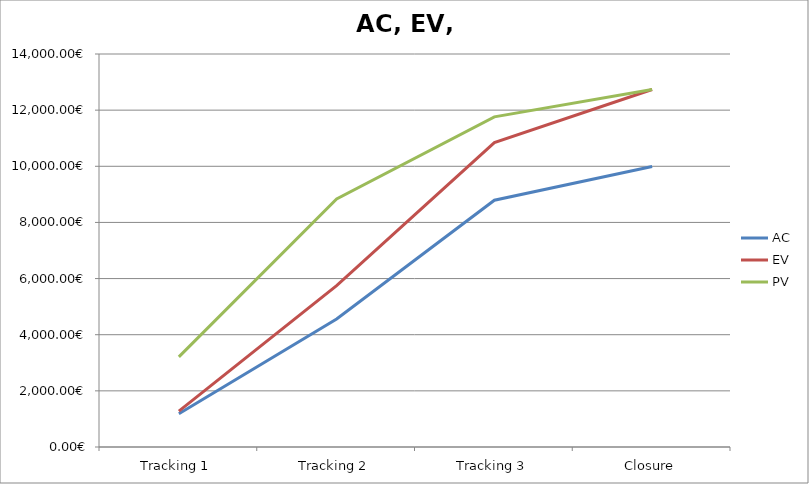
| Category | AC | EV | PV |
|---|---|---|---|
| Tracking 1 | 1185 | 1278 | 3210 |
| Tracking 2 | 4560 | 5750.7 | 8835 |
| Tracking 3 | 8790 | 10845.15 | 11760 |
| Closure | 9990 | 12735 | 12735 |